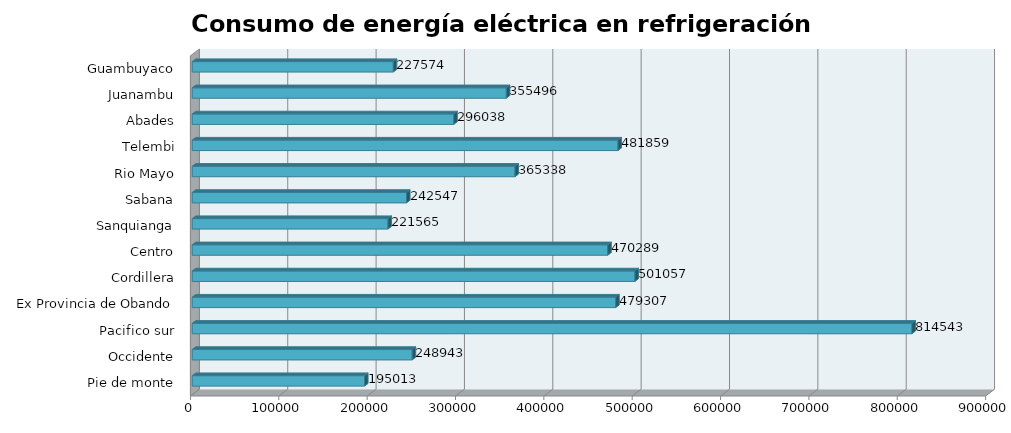
| Category | Series 0 |
|---|---|
| Pie de monte | 195012.794 |
| Occidente | 248943.141 |
| Pacifico sur | 814542.509 |
| Ex Provincia de Obando | 479307.191 |
| Cordillera | 501057.334 |
| Centro | 470288.918 |
| Sanquianga | 221565.437 |
| Sabana | 242546.784 |
| Rio Mayo | 365338.311 |
| Telembi | 481858.58 |
| Abades | 296038.4 |
| Juanambu | 355496.041 |
| Guambuyaco | 227573.793 |